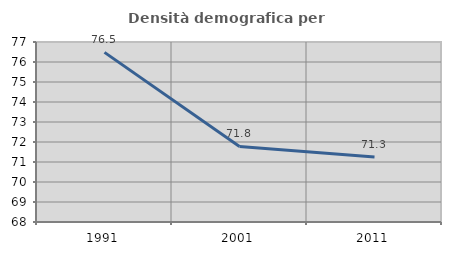
| Category | Densità demografica |
|---|---|
| 1991.0 | 76.482 |
| 2001.0 | 71.778 |
| 2011.0 | 71.253 |